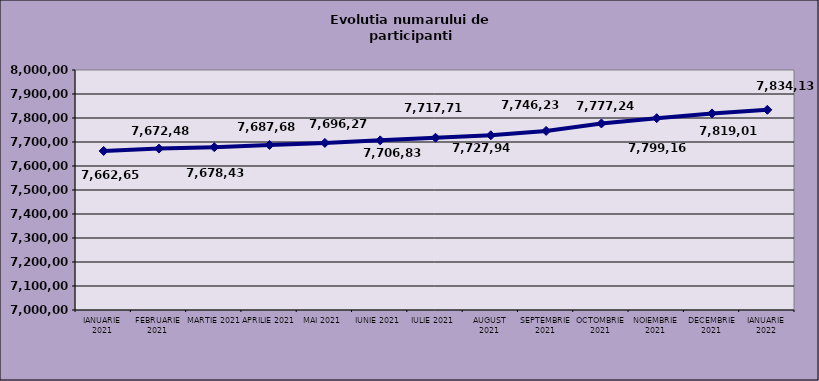
| Category | Series 0 |
|---|---|
| IANUARIE 2021 | 7662659 |
| FEBRUARIE 2021 | 7672485 |
| MARTIE 2021 | 7678435 |
| APRILIE 2021 | 7687688 |
| MAI 2021 | 7696276 |
| IUNIE 2021 | 7706835 |
| IULIE 2021 | 7717710 |
| AUGUST 2021 | 7727948 |
| SEPTEMBRIE 2021 | 7746233 |
| OCTOMBRIE 2021 | 7777244 |
| NOIEMBRIE 2021 | 7799163 |
| DECEMBRIE 2021 | 7819011 |
| IANUARIE 2022 | 7834131 |